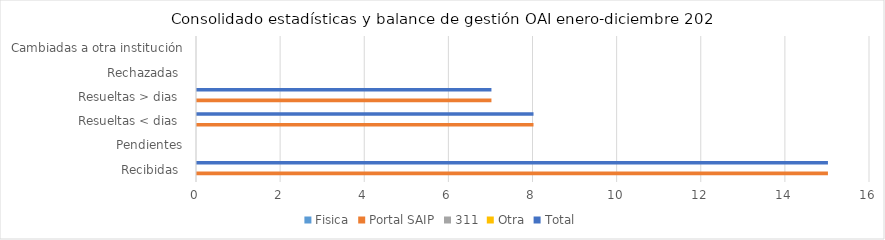
| Category | Fisica | Portal SAIP | 311 | Otra | Total |
|---|---|---|---|---|---|
| Recibidas  | 0 | 15 | 0 | 0 | 15 |
| Pendientes | 0 | 0 | 0 | 0 | 0 |
| Resueltas < dias  | 0 | 8 | 0 | 0 | 8 |
| Resueltas > dias  | 0 | 7 | 0 | 0 | 7 |
| Rechazadas  | 0 | 0 | 0 | 0 | 0 |
| Cambiadas a otra institución | 0 | 0 | 0 | 0 | 0 |